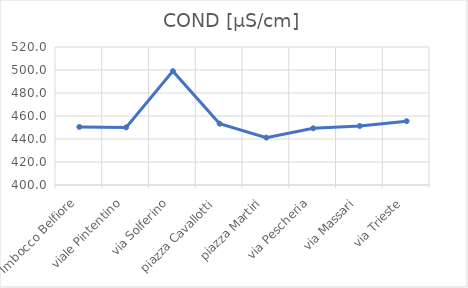
| Category | COND [µS/cm] |
|---|---|
| Imbocco Belfiore | 450.5 |
| viale Pintentino | 450.1 |
| via Solferino | 499 |
| piazza Cavallotti | 453.3 |
| piazza Martiri | 441.2 |
| via Pescheria | 449.3 |
| via Massari | 451.3 |
| via Trieste | 455.5 |